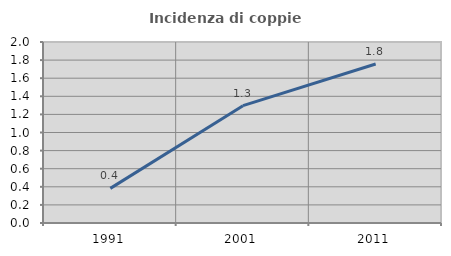
| Category | Incidenza di coppie miste |
|---|---|
| 1991.0 | 0.382 |
| 2001.0 | 1.297 |
| 2011.0 | 1.757 |